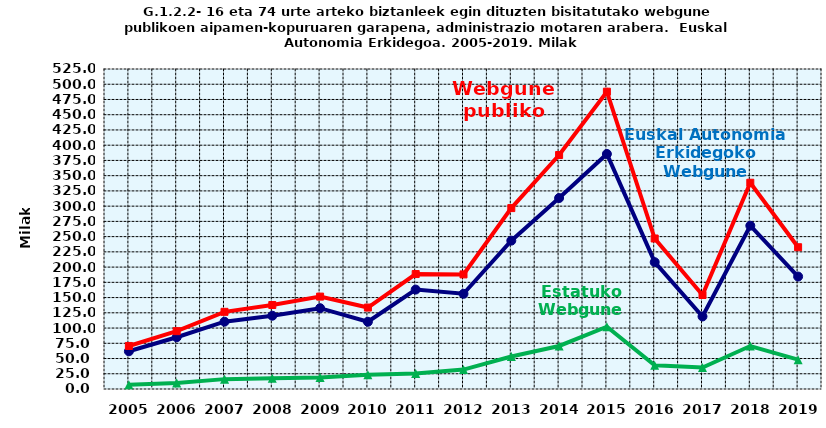
| Category | Euskal Autonomia Erkidegoko Webgune publikoak | Estatuko Webgune publikoak | Webgune publiko guztira |
|---|---|---|---|
| 2005.0 | 61.9 | 7 | 70.6 |
| 2006.0 | 84.9 | 10 | 94.9 |
| 2007.0 | 110.4 | 16.2 | 126.6 |
| 2008.0 | 120.2 | 17.6 | 137.8 |
| 2009.0 | 132.6 | 19 | 151.6 |
| 2010.0 | 110.3 | 23.3 | 133.6 |
| 2011.0 | 163.1 | 25.5 | 188.6 |
| 2012.0 | 156.2 | 31.8 | 188 |
| 2013.0 | 243.4 | 53.4 | 296.8 |
| 2014.0 | 313.3 | 70.6 | 383.9 |
| 2015.0 | 385.6 | 102.2 | 487.8 |
| 2016.0 | 208.1 | 38.8 | 246.9 |
| 2017.0 | 119 | 35.2 | 154.2 |
| 2018.0 | 267.9 | 70.5 | 338.4 |
| 2019.0 | 184.5 | 48.1 | 232.6 |